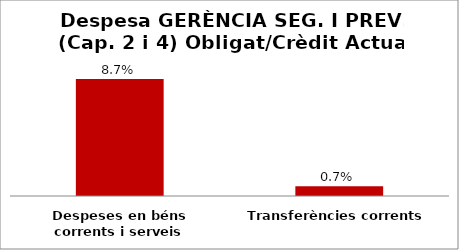
| Category | Series 0 |
|---|---|
| Despeses en béns corrents i serveis | 0.087 |
| Transferències corrents | 0.007 |